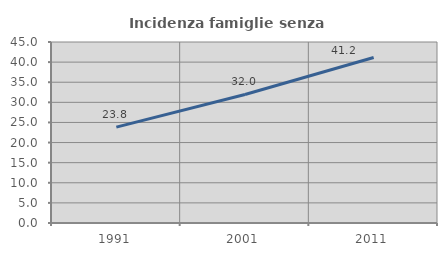
| Category | Incidenza famiglie senza nuclei |
|---|---|
| 1991.0 | 23.844 |
| 2001.0 | 31.962 |
| 2011.0 | 41.155 |